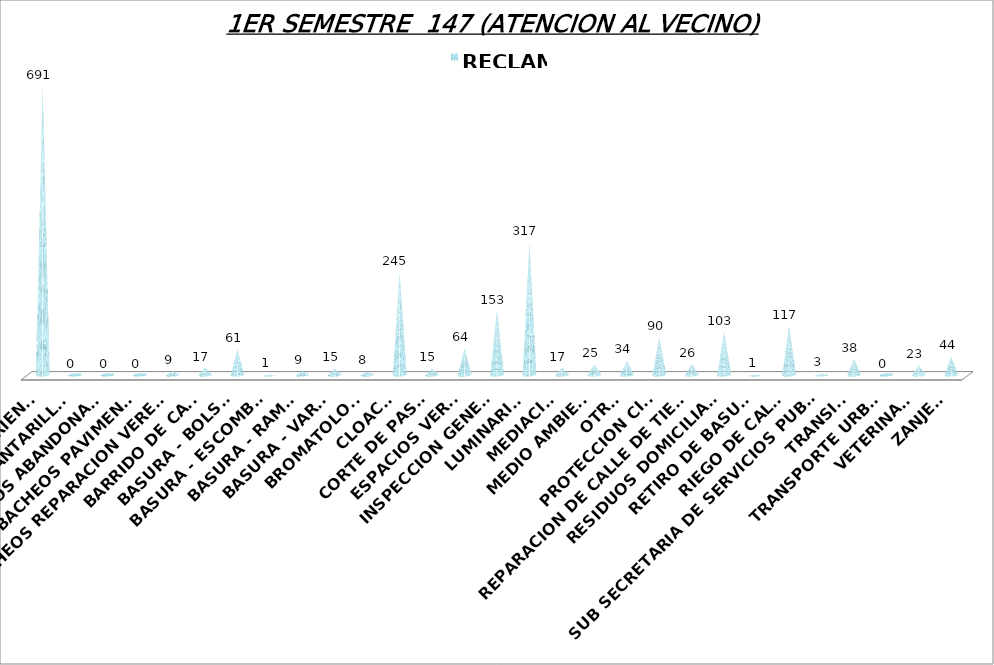
| Category | RECLAMOS |
|---|---|
| AGUAS CORRIENTES | 691 |
| ALCANTARILLAS  | 0 |
| AUTOS ABANDONADOS | 0 |
| BACHEOS PAVIMENTOS | 0 |
| BACHEOS REPARACION VEREDAS | 9 |
| BARRIDO DE CALLE | 17 |
| BASURA - BOLSAS | 61 |
| BASURA - ESCOMBRO | 1 |
| BASURA - RAMAS | 9 |
| BASURA - VARIAS | 15 |
| BROMATOLOGIA | 8 |
| CLOACAS | 245 |
| CORTE DE PASTO | 15 |
| ESPACIOS VERDES | 64 |
| INSPECCION GENERAL | 153 |
| LUMINARIAS | 317 |
| MEDIACION | 17 |
| MEDIO AMBIENTE | 25 |
| OTROS | 34 |
| PROTECCION CIVIL | 90 |
| REPARACION DE CALLE DE TIERRA | 26 |
| RESIDUOS DOMICILIARIOS | 103 |
| RETIRO DE BASURA | 1 |
| RIEGO DE CALLE | 117 |
| SUB SECRETARIA DE SERVICIOS PUBLICOS | 3 |
| TRANSITO | 38 |
| TRANSPORTE URBANO | 0 |
| VETERINARIA | 23 |
| ZANJEOS | 44 |